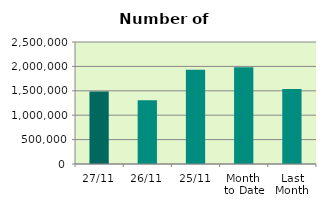
| Category | Series 0 |
|---|---|
| 27/11 | 1486386 |
| 26/11 | 1306334 |
| 25/11 | 1933510 |
| Month 
to Date | 1983092.5 |
| Last
Month | 1538680.909 |